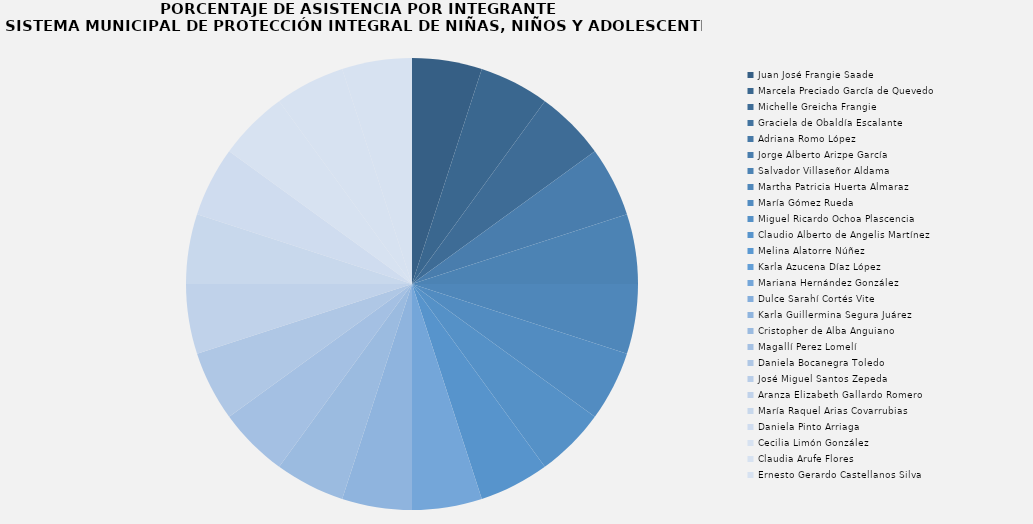
| Category | Juan José Frangie Saade |
|---|---|
| Juan José Frangie Saade | 1 |
| Marcela Preciado García de Quevedo | 1 |
| Michelle Greicha Frangie | 1 |
| Graciela de Obaldía Escalante | 0 |
| Adriana Romo López | 0 |
| Jorge Alberto Arizpe García | 1 |
| Salvador Villaseñor Aldama | 1 |
| Martha Patricia Huerta Almaraz | 1 |
| María Gómez Rueda | 1 |
| Miguel Ricardo Ochoa Plascencia | 1 |
| Claudio Alberto de Angelis Martínez | 1 |
| Melina Alatorre Núñez | 0 |
| Karla Azucena Díaz López | 0 |
| Mariana Hernández González  | 1 |
| Dulce Sarahí Cortés Vite | 0 |
| Karla Guillermina Segura Juárez | 1 |
| Cristopher de Alba Anguiano | 1 |
| Magallí Perez Lomelí | 1 |
| Daniela Bocanegra Toledo | 1 |
| José Miguel Santos Zepeda  | 0 |
| Aranza Elizabeth Gallardo Romero | 1 |
| María Raquel Arias Covarrubias  | 1 |
| Daniela Pinto Arriaga  | 1 |
| Cecilia Limón González  | 1 |
| Claudia Arufe Flores | 1 |
| Ernesto Gerardo Castellanos Silva | 1 |